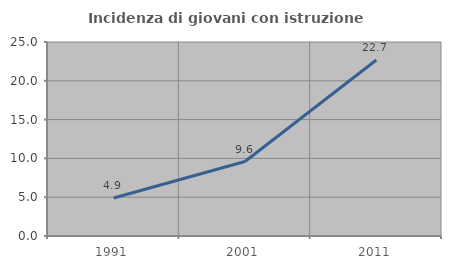
| Category | Incidenza di giovani con istruzione universitaria |
|---|---|
| 1991.0 | 4.895 |
| 2001.0 | 9.596 |
| 2011.0 | 22.68 |